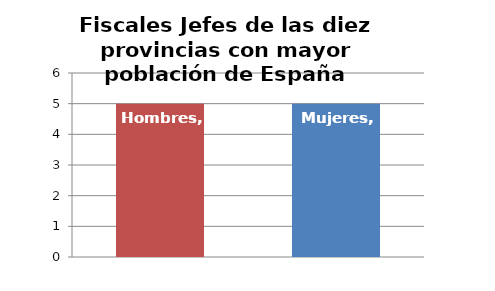
| Category | Fiscales Jefes de las diez provincias con mayor población de España |
|---|---|
| Hombres | 5 |
| Mujeres | 5 |